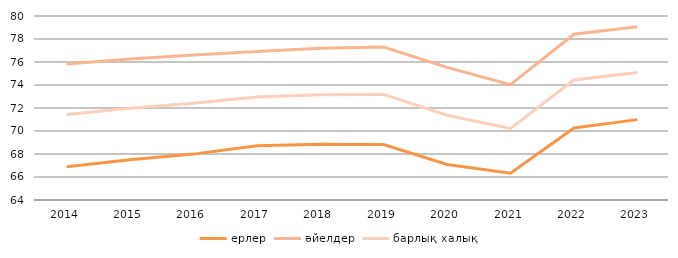
| Category | ерлер | әйелдер | барлық халық |
|---|---|---|---|
| 2014.0 | 66.9 | 75.82 | 71.44 |
| 2015.0 | 67.49 | 76.26 | 71.97 |
| 2016.0 | 67.99 | 76.61 | 72.41 |
| 2017.0 | 68.72 | 76.92 | 72.95 |
| 2018.0 | 68.84 | 77.19 | 73.15 |
| 2019.0 | 68.82 | 77.3 | 73.18 |
| 2020.0 | 67.09 | 75.53 | 71.37 |
| 2021.0 | 66.33 | 74.03 | 70.23 |
| 2022.0 | 70.26 | 78.41 | 74.44 |
| 2023.0 | 70.989 | 79.055 | 75.094 |